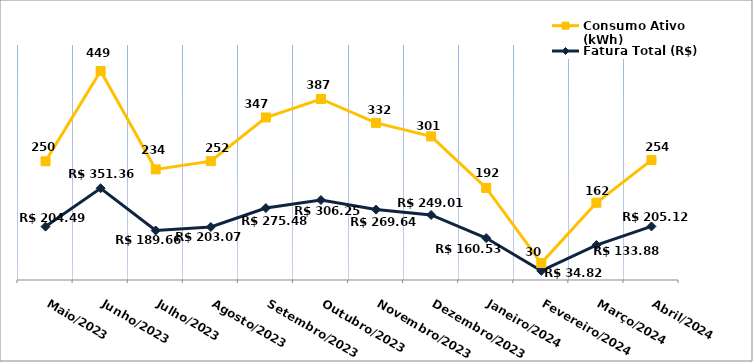
| Category | Fatura Total (R$) | Consumo Ativo (kWh) |
|---|---|---|
| Maio/2023 | 204.49 | 250 |
| Junho/2023 | 351.36 | 449 |
| Julho/2023 | 189.66 | 234 |
| Agosto/2023 | 203.07 | 252 |
| Setembro/2023 | 275.48 | 347 |
| Outubro/2023 | 306.25 | 387 |
| Novembro/2023 | 269.64 | 332 |
| Dezembro/2023 | 249.01 | 301 |
| Janeiro/2024 | 160.53 | 192 |
| Fevereiro/2024 | 34.82 | 30 |
| Março/2024 | 133.88 | 162 |
| Abril/2024 | 205.12 | 254 |